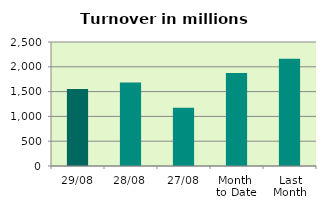
| Category | Series 0 |
|---|---|
| 29/08 | 1550.135 |
| 28/08 | 1685.195 |
| 27/08 | 1175.947 |
| Month 
to Date | 1874.682 |
| Last
Month | 2159.874 |